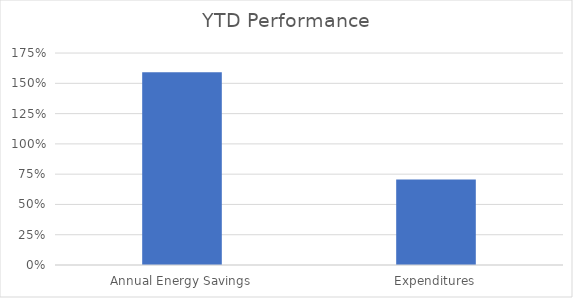
| Category | Series 0 |
|---|---|
| Annual Energy Savings | 1.592 |
| Expenditures | 0.706 |